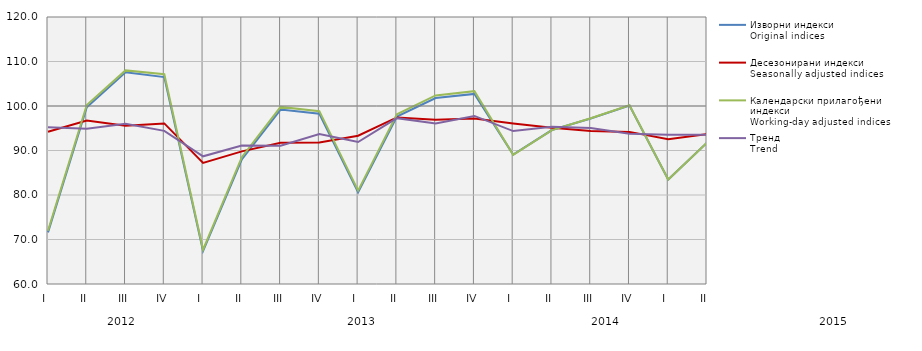
| Category | Изворни индекси
Original indices | Десезонирани индекси
Seasonally adjusted indices | Календарски прилагођени индекси
Working-day adjusted indices | Тренд
Trend |
|---|---|---|---|---|
| I  | 71.601 | 94.202 | 71.98 | 95.221 |
| II | 99.705 | 96.745 | 100.233 | 94.867 |
| III | 107.6 | 95.552 | 108 | 96.025 |
| IV | 106.508 | 96.085 | 107.139 | 94.421 |
| I  | 67.411 | 87.203 | 67.713 | 88.699 |
| II | 88.026 | 89.799 | 88.493 | 91.105 |
| III | 99.2 | 91.759 | 99.791 | 91.09 |
| IV | 98.255 | 91.778 | 98.847 | 93.676 |
| I  | 80.624 | 93.311 | 80.991 | 91.912 |
| II | 97.612 | 97.436 | 98.129 | 97.273 |
| III | 101.777 | 96.906 | 102.382 | 96.075 |
| IV | 102.721 | 97.167 | 103.335 | 97.771 |
| I  | 89.1 | 96.049 | 89.04 | 94.369 |
| II | 94.6 | 95.095 | 94.591 | 95.349 |
| III | 97.2 | 94.405 | 97.256 | 95.047 |
| IV | 100.1 | 94.183 | 100.161 | 93.756 |
| I  | 83.476 | 92.548 | 83.476 | 93.528 |
| II | 91.763 | 93.685 | 91.763 | 93.553 |